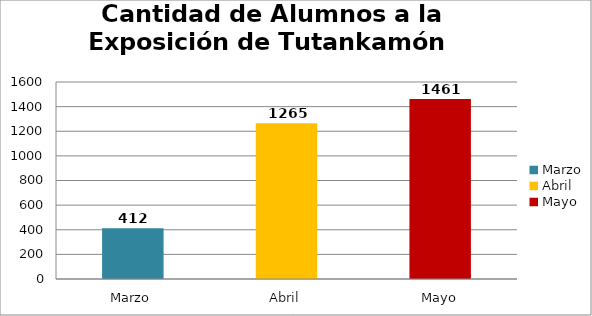
| Category | Series 0 |
|---|---|
| Marzo | 412 |
| Abril | 1265 |
| Mayo | 1461 |